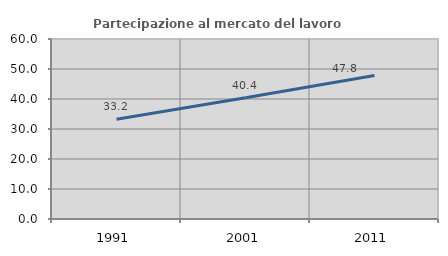
| Category | Partecipazione al mercato del lavoro  femminile |
|---|---|
| 1991.0 | 33.221 |
| 2001.0 | 40.414 |
| 2011.0 | 47.821 |